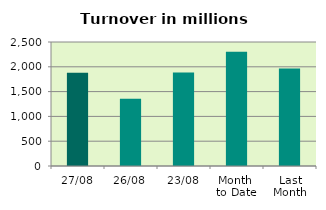
| Category | Series 0 |
|---|---|
| 27/08 | 1878.872 |
| 26/08 | 1355.504 |
| 23/08 | 1884.333 |
| Month 
to Date | 2303.982 |
| Last
Month | 1965.856 |